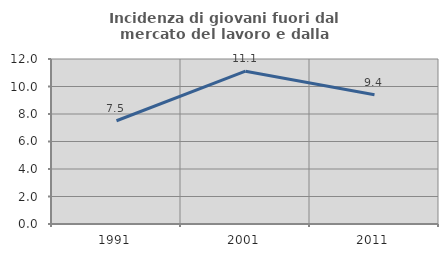
| Category | Incidenza di giovani fuori dal mercato del lavoro e dalla formazione  |
|---|---|
| 1991.0 | 7.509 |
| 2001.0 | 11.111 |
| 2011.0 | 9.406 |